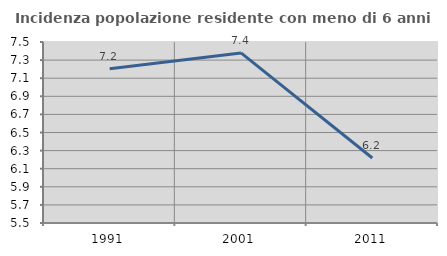
| Category | Incidenza popolazione residente con meno di 6 anni |
|---|---|
| 1991.0 | 7.205 |
| 2001.0 | 7.379 |
| 2011.0 | 6.218 |